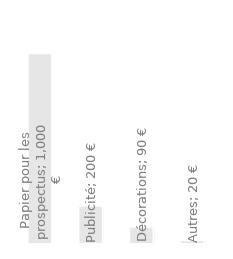
| Category | Dépenses annuelles |
|---|---|
| Papier pour les prospectus | 1000 |
| Publicité | 200 |
| Décorations | 90 |
| Autres | 20 |